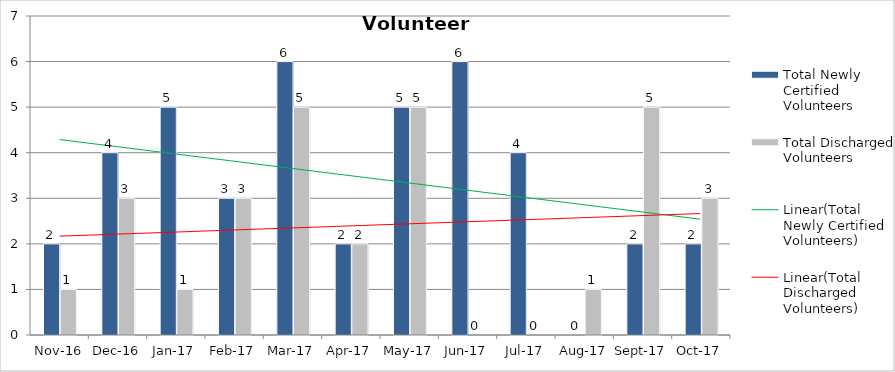
| Category | Total Newly Certified Volunteers | Total Discharged Volunteers |
|---|---|---|
| 2016-11-01 | 2 | 1 |
| 2016-12-01 | 4 | 3 |
| 2017-01-01 | 5 | 1 |
| 2017-02-01 | 3 | 3 |
| 2017-03-01 | 6 | 5 |
| 2017-04-01 | 2 | 2 |
| 2017-05-01 | 5 | 5 |
| 2017-06-01 | 6 | 0 |
| 2017-07-01 | 4 | 0 |
| 2017-08-01 | 0 | 1 |
| 2017-09-01 | 2 | 5 |
| 2017-10-01 | 2 | 3 |